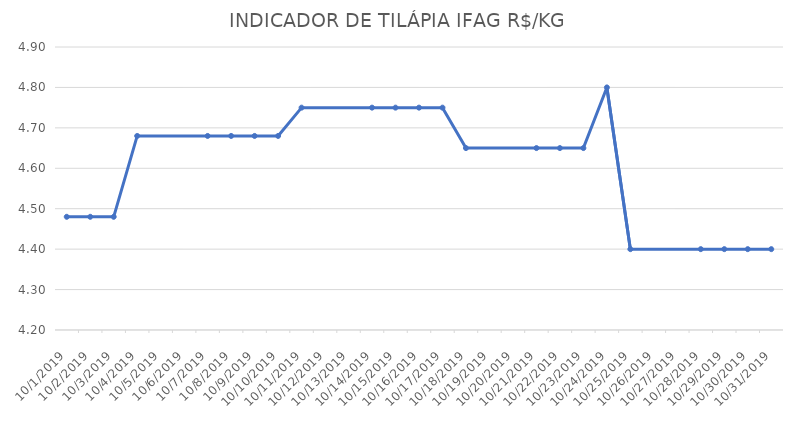
| Category | INDICADOR DE TILÁPIA IFAG |
|---|---|
| 10/1/19 | 4.48 |
| 10/2/19 | 4.48 |
| 10/3/19 | 4.48 |
| 10/4/19 | 4.68 |
| 10/7/19 | 4.68 |
| 10/8/19 | 4.68 |
| 10/9/19 | 4.68 |
| 10/10/19 | 4.68 |
| 10/11/19 | 4.75 |
| 10/14/19 | 4.75 |
| 10/15/19 | 4.75 |
| 10/16/19 | 4.75 |
| 10/17/19 | 4.75 |
| 10/18/19 | 4.65 |
| 10/21/19 | 4.65 |
| 10/22/19 | 4.65 |
| 10/23/19 | 4.65 |
| 10/24/19 | 4.8 |
| 10/25/19 | 4.4 |
| 10/28/19 | 4.4 |
| 10/29/19 | 4.4 |
| 10/30/19 | 4.4 |
| 10/31/19 | 4.4 |